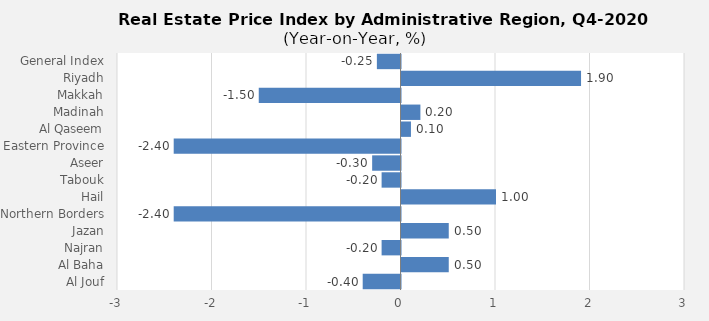
| Category | 2020 |
|---|---|
| General Index | -0.25 |
| Riyadh | 1.9 |
| Makkah | -1.5 |
| Madinah | 0.2 |
| Al Qaseem | 0.1 |
| Eastern Province | -2.4 |
| Aseer | -0.3 |
| Tabouk | -0.2 |
| Hail | 1 |
| Northern Borders | -2.4 |
| Jazan | 0.5 |
| Najran | -0.2 |
| Al Baha | 0.5 |
| Al Jouf | -0.4 |